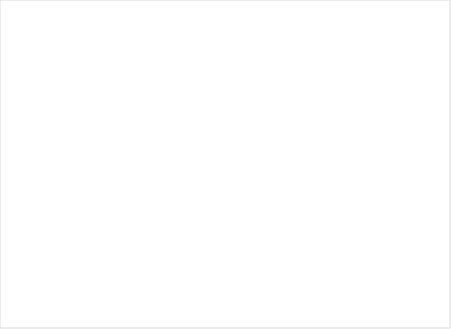
| Category | Total |
|---|---|
| Ja, af og til | 3 |